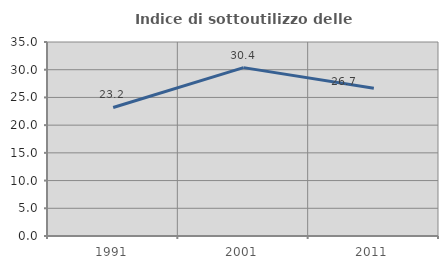
| Category | Indice di sottoutilizzo delle abitazioni  |
|---|---|
| 1991.0 | 23.188 |
| 2001.0 | 30.38 |
| 2011.0 | 26.667 |